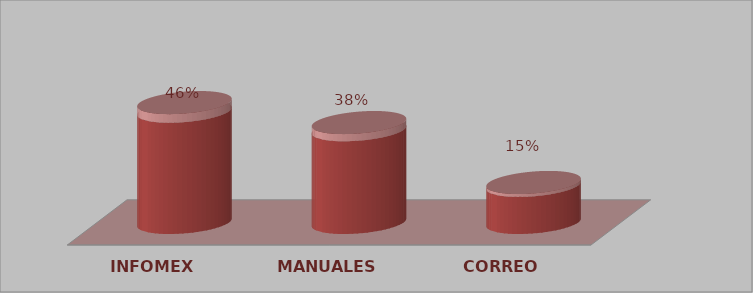
| Category | Series 0 | Series 1 |
|---|---|---|
| INFOMEX | 6 | 0.462 |
| MANUALES | 5 | 0.385 |
| CORREO | 2 | 0.154 |